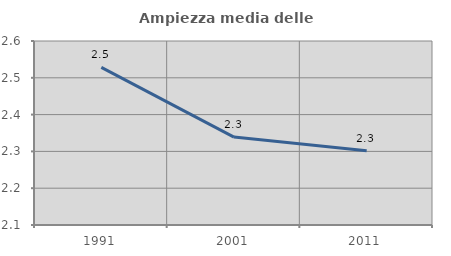
| Category | Ampiezza media delle famiglie |
|---|---|
| 1991.0 | 2.528 |
| 2001.0 | 2.339 |
| 2011.0 | 2.302 |